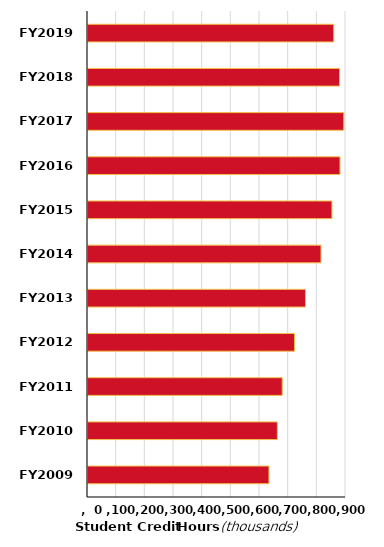
| Category | Total SCH |
|---|---|
| FY2009 | 634669 |
| FY2010 | 663954 |
| FY2011 | 681034 |
| FY2012 | 723841 |
| FY2013 | 762148 |
| FY2014 | 816235 |
| FY2015 | 854434.71 |
| FY2016 | 882547.83 |
| FY2017 | 895711.528 |
| FY2018 | 881189.1 |
| FY2019 | 860729.812 |